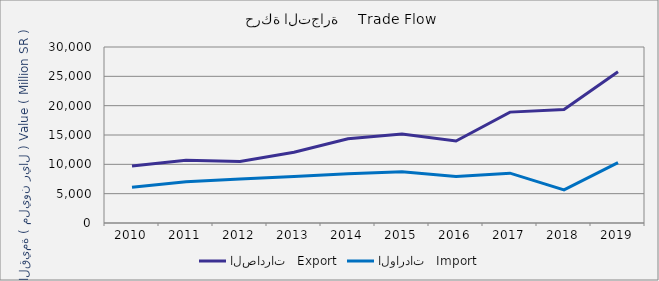
| Category | الصادرات   Export | الواردات   Import |
|---|---|---|
| 2010.0 | 9725273788 | 6074346837 |
| 2011.0 | 10696326452 | 7021428900 |
| 2012.0 | 10498368354 | 7520003661 |
| 2013.0 | 12055552707 | 7909428723 |
| 2014.0 | 14344174823 | 8413949875 |
| 2015.0 | 15181185189 | 8719394321 |
| 2016.0 | 13974163121 | 7932570482 |
| 2017.0 | 18901709825 | 8492303585 |
| 2018.0 | 19360393780 | 5635124375 |
| 2019.0 | 25794146911 | 10296703257 |